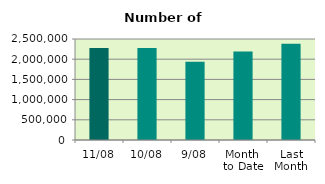
| Category | Series 0 |
|---|---|
| 11/08 | 2279336 |
| 10/08 | 2274284 |
| 9/08 | 1935442 |
| Month 
to Date | 2192446.222 |
| Last
Month | 2380266.19 |